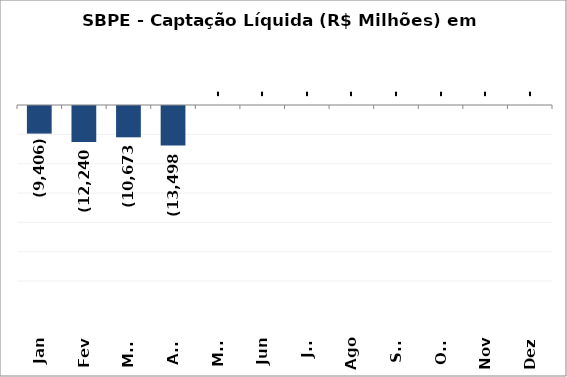
| Category | SBPE - Captação Líquida (R$ Milhões) em 2019 |
|---|---|
| Jan | -9405.745 |
| Fev | -12239.879 |
| Mar | -10672.722 |
| Abr | -13498.454 |
| Mai | 0 |
| Jun | 0 |
| Jul | 0 |
| Ago | 0 |
| Set | 0 |
| Out | 0 |
| Nov | 0 |
| Dez | 0 |